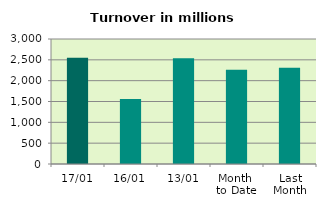
| Category | Series 0 |
|---|---|
| 17/01 | 2547.787 |
| 16/01 | 1558.77 |
| 13/01 | 2535.026 |
| Month 
to Date | 2260.917 |
| Last
Month | 2310.602 |